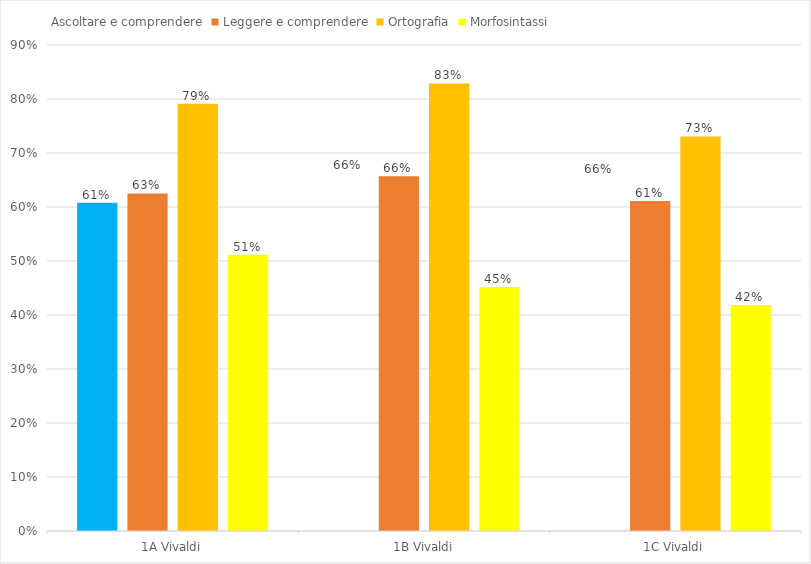
| Category | Ascoltare e comprendere | Leggere e comprendere | Ortografia | Morfosintassi |
|---|---|---|---|---|
| 1A Vivaldi | 0.608 | 0.625 | 0.791 | 0.512 |
| 1B Vivaldi | 0.664 | 0.657 | 0.829 | 0.452 |
| 1C Vivaldi | 0.656 | 0.611 | 0.731 | 0.419 |